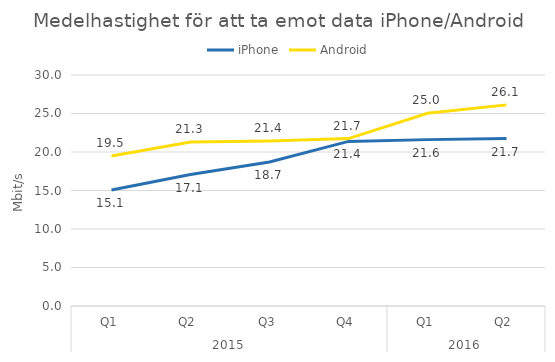
| Category | iPhone | Android |
|---|---|---|
| 0 | 15.069 | 19.484 |
| 1 | 17.071 | 21.307 |
| 2 | 18.695 | 21.429 |
| 3 | 21.379 | 21.738 |
| 4 | 21.607 | 25.034 |
| 5 | 21.746 | 26.12 |